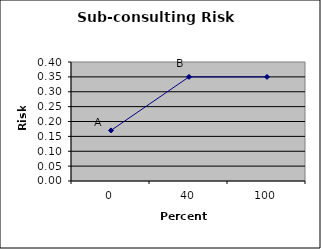
| Category | Risk |
|---|---|
| 0.0 | 0.17 |
| 40.0 | 0.35 |
| 100.0 | 0.35 |